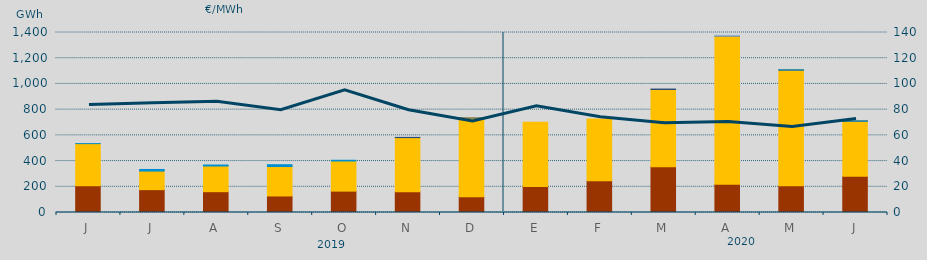
| Category | Carbón | Ciclo Combinado | Consumo Bombeo | Hidráulica | Otras Renovables | Turbinación bombeo |
|---|---|---|---|---|---|---|
| J | 209003 | 326625.6 | 0 | 334.5 | 0 | 0 |
| J | 177655 | 144531.3 | 0 | 12515 | 0 | 0 |
| A | 161808 | 199805.1 | 0 | 7890 | 0 | 0 |
| S | 128712 | 228795.2 | 0 | 14281 | 0 | 0 |
| O | 166180 | 234526.2 | 0 | 5517.1 | 0 | 0 |
| N | 161365 | 421030.7 | 0 | 0 | 1775.2 | 0 |
| D | 122168 | 612250.1 | 0 | 0 | 164.2 | 0 |
| E | 202940 | 498564 | 0 | 0 | 0 | 0 |
| F | 247227 | 479450.3 | 0 | 0 | 0 | 0 |
| M | 355297 | 601360.3 | 3495.6 | 0 | 0 | 0 |
| A | 220571 | 1152051.4 | 585 | 0 | 0 | 5000 |
| M | 207721 | 900435.9 | 185 | 630 | 0 | 0 |
| J | 281442 | 429259.5 | 370 | 680 | 0 | 0 |